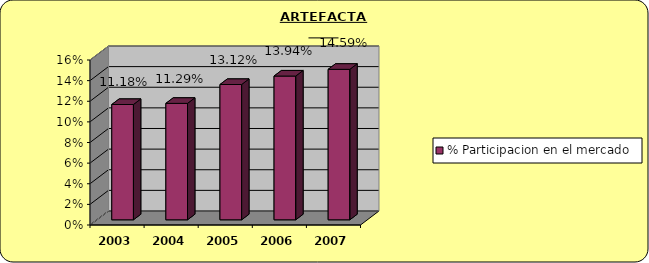
| Category | % Participacion en el mercado |
|---|---|
| 2003.0 | 0.112 |
| 2004.0 | 0.113 |
| 2005.0 | 0.131 |
| 2006.0 | 0.139 |
| 2007.0 | 0.146 |